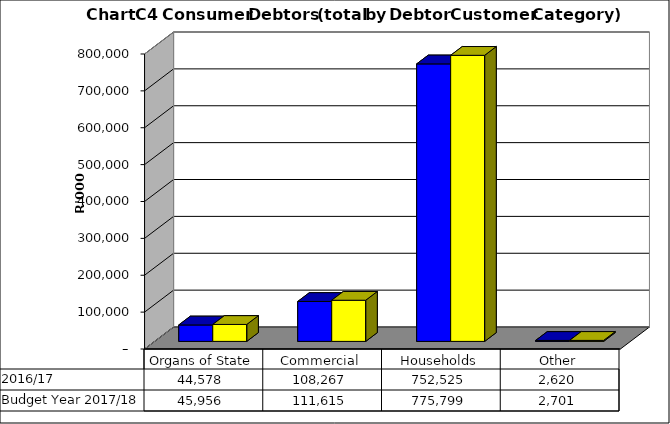
| Category |  2016/17  | Budget Year 2017/18 |
|---|---|---|
| Organs of State | 44577720.455 | 45956412.84 |
| Commercial | 108266801.88 | 111615259.67 |
| Households | 752525241.353 | 775799217.89 |
| Other | 2619819.805 | 2700845.16 |